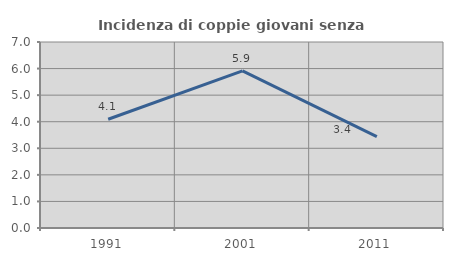
| Category | Incidenza di coppie giovani senza figli |
|---|---|
| 1991.0 | 4.092 |
| 2001.0 | 5.912 |
| 2011.0 | 3.441 |